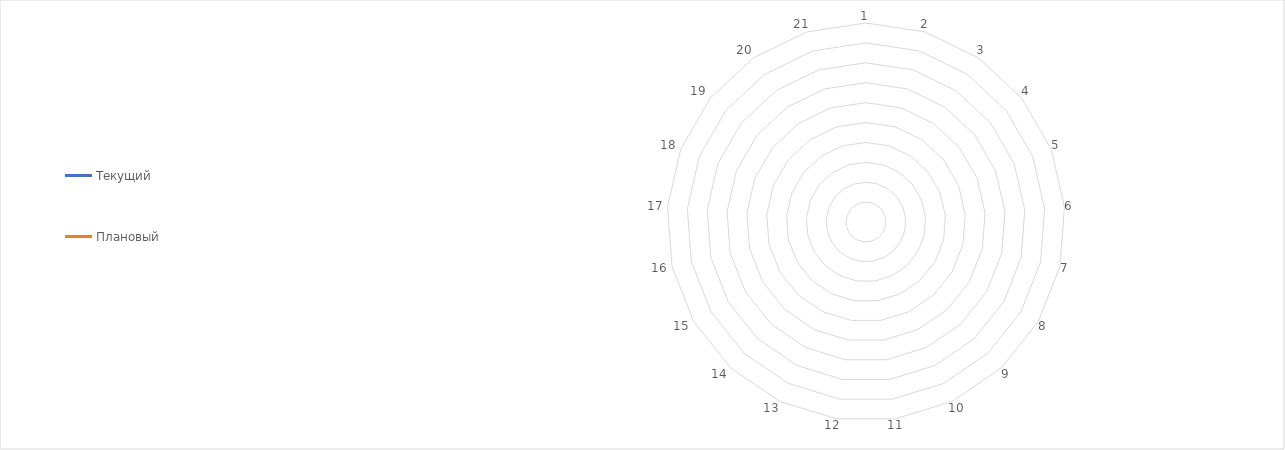
| Category | Текущий | Плановый |
|---|---|---|
| 1.0 | 0 | 0 |
| 2.0 | 0 | 0 |
| 3.0 | 0 | 0 |
| 4.0 | 0 | 0 |
| 5.0 | 0 | 0 |
| 6.0 | 0 | 0 |
| 7.0 | 0 | 0 |
| 8.0 | 0 | 0 |
| 9.0 | 0 | 0 |
| 10.0 | 0 | 0 |
| 11.0 | 0 | 0 |
| 12.0 | 0 | 0 |
| 13.0 | 0 | 0 |
| 14.0 | 0 | 0 |
| 15.0 | 0 | 0 |
| 16.0 | 0 | 0 |
| 17.0 | 0 | 0 |
| 18.0 | 0 | 0 |
| 19.0 | 0 | 0 |
| 20.0 | 0 | 0 |
| 21.0 | 0 | 0 |